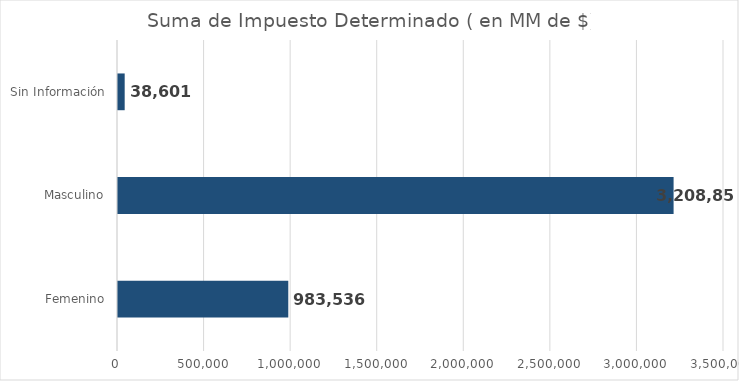
| Category | Series 0 |
|---|---|
| Femenino | 983536.2 |
| Masculino | 3208853 |
| Sin Información | 38601 |